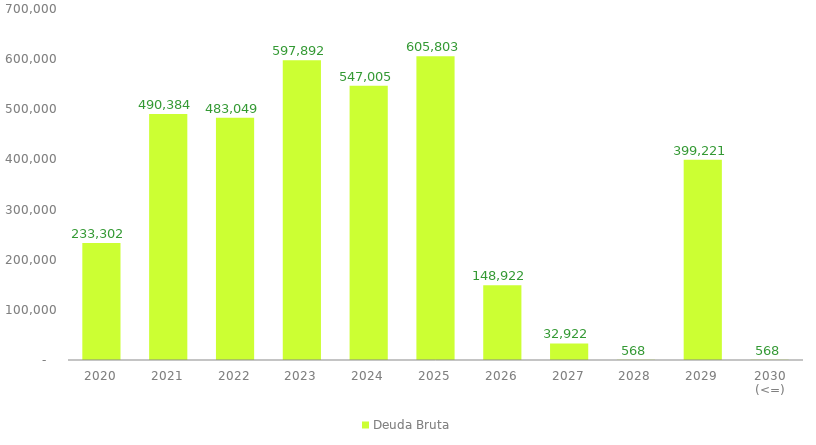
| Category | Deuda Bruta |
|---|---|
| 2020 | 233302.286 |
| 2021 | 490383.898 |
| 2022 | 483049.25 |
| 2023 | 597892.421 |
| 2024 | 547005.132 |
| 2025 | 605802.563 |
| 2026 | 148922.113 |
| 2027 | 32922.49 |
| 2028 | 567.533 |
| 2029 | 399220.723 |
| 2030 (<=) | 567.533 |